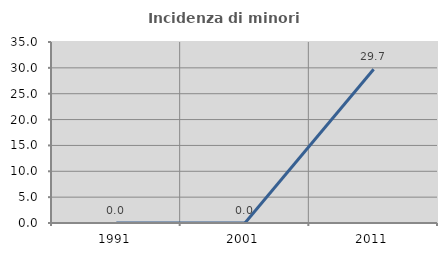
| Category | Incidenza di minori stranieri |
|---|---|
| 1991.0 | 0 |
| 2001.0 | 0 |
| 2011.0 | 29.73 |